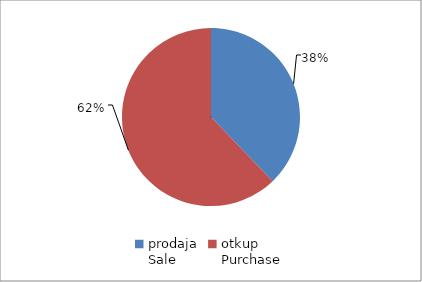
| Category | Series 0 |
|---|---|
| prodaja
Sale | 5648569 |
| otkup
Purchase | 9284886 |